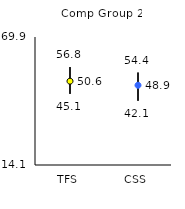
| Category | 25th | 75th | Mean |
|---|---|---|---|
| TFS | 45.1 | 56.8 | 50.64 |
| CSS | 42.1 | 54.4 | 48.86 |